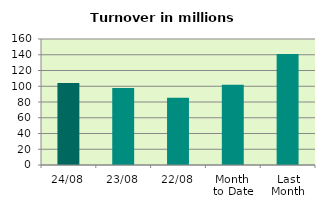
| Category | Series 0 |
|---|---|
| 24/08 | 104.103 |
| 23/08 | 97.841 |
| 22/08 | 85.501 |
| Month 
to Date | 101.847 |
| Last
Month | 140.832 |